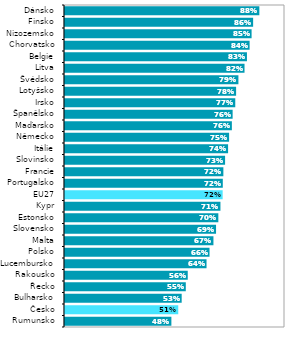
| Category | Series 1 |
|---|---|
| Rumunsko | 0.484 |
| Česko | 0.515 |
| Bulharsko | 0.53 |
| Řecko | 0.549 |
| Rakousko | 0.558 |
| Lucembursko | 0.643 |
| Polsko | 0.657 |
| Malta | 0.675 |
| Slovensko | 0.687 |
| Estonsko | 0.697 |
| Kypr | 0.707 |
| EU27 | 0.717 |
| Portugalsko | 0.717 |
| Francie | 0.72 |
| Slovinsko | 0.728 |
| Itálie | 0.741 |
| Německo | 0.746 |
| Maďarsko | 0.759 |
| Španělsko | 0.762 |
| Irsko | 0.774 |
| Lotyšsko | 0.778 |
| Švédsko | 0.788 |
| Litva | 0.816 |
| Belgie | 0.827 |
| Chorvatsko | 0.839 |
| Nizozemsko | 0.848 |
| Finsko | 0.855 |
| Dánsko | 0.883 |